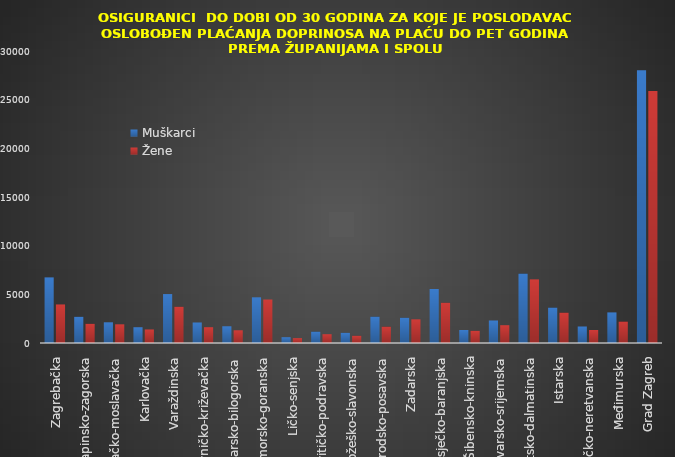
| Category | Muškarci | Žene |
|---|---|---|
| Zagrebačka | 6741 | 3961 |
| Krapinsko-zagorska | 2695 | 1974 |
| Sisačko-moslavačka | 2127 | 1920 |
| Karlovačka | 1622 | 1392 |
| Varaždinska | 5027 | 3727 |
| Koprivničko-križevačka | 2108 | 1623 |
| Bjelovarsko-bilogorska | 1721 | 1307 |
| Primorsko-goranska | 4694 | 4469 |
| Ličko-senjska | 596 | 499 |
| Virovitičko-podravska | 1172 | 905 |
| Požeško-slavonska | 1048 | 747 |
| Brodsko-posavska | 2709 | 1683 |
| Zadarska | 2597 | 2432 |
| Osječko-baranjska | 5546 | 4137 |
| Šibensko-kninska | 1334 | 1253 |
| Vukovarsko-srijemska | 2313 | 1828 |
| Splitsko-dalmatinska | 7133 | 6538 |
| Istarska | 3641 | 3120 |
| Dubrovačko-neretvanska | 1697 | 1334 |
| Međimurska | 3144 | 2207 |
| Grad Zagreb | 28027 | 25902 |